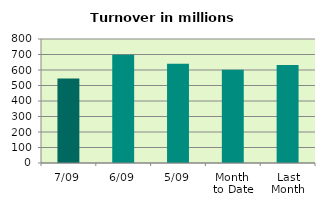
| Category | Series 0 |
|---|---|
| 7/09 | 545.944 |
| 6/09 | 698.659 |
| 5/09 | 640.534 |
| Month 
to Date | 601.945 |
| Last
Month | 632.895 |